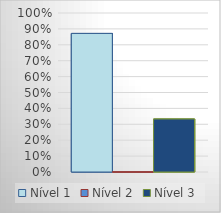
| Category | Nível 1 | Nível 2 | Nível 3 |
|---|---|---|---|
| 0 | 0.871 | 0 | 0.333 |